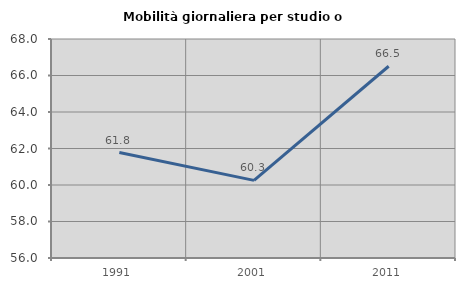
| Category | Mobilità giornaliera per studio o lavoro |
|---|---|
| 1991.0 | 61.777 |
| 2001.0 | 60.252 |
| 2011.0 | 66.508 |